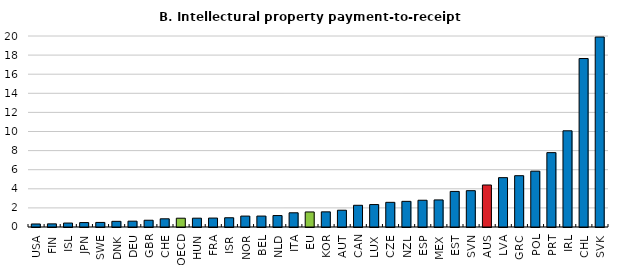
| Category | IP payments-to-receipts |
|---|---|
| USA | 0.317 |
| FIN | 0.328 |
| ISL | 0.414 |
| JPN | 0.464 |
| SWE | 0.479 |
| DNK | 0.592 |
| DEU | 0.611 |
| GBR | 0.708 |
| CHE | 0.858 |
| OECD | 0.92 |
| HUN | 0.923 |
| FRA | 0.935 |
| ISR | 0.969 |
| NOR | 1.143 |
| BEL | 1.145 |
| NLD | 1.198 |
| ITA | 1.488 |
| EU | 1.574 |
| KOR | 1.586 |
| AUT | 1.757 |
| CAN | 2.274 |
| LUX | 2.351 |
| CZE | 2.583 |
| NZL | 2.686 |
| ESP | 2.802 |
| MEX | 2.835 |
| EST | 3.726 |
| SVN | 3.804 |
| AUS | 4.399 |
| LVA | 5.168 |
| GRC | 5.373 |
| POL | 5.846 |
| PRT | 7.788 |
| IRL | 10.073 |
| CHL | 17.641 |
| SVK | 19.893 |